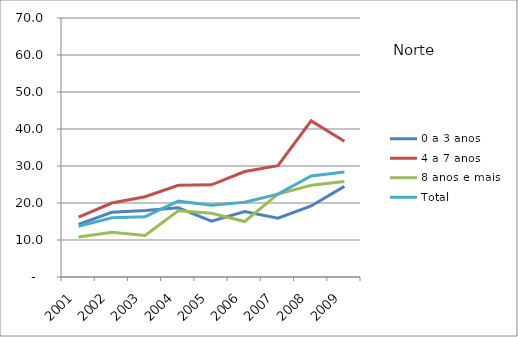
| Category | 0 a 3 anos | 4 a 7 anos | 8 anos e mais | Total |
|---|---|---|---|---|
| 2001.0 | 14.2 | 16.2 | 10.8 | 13.7 |
| 2002.0 | 17.5 | 20 | 12.1 | 16 |
| 2003.0 | 18 | 21.7 | 11.2 | 16.3 |
| 2004.0 | 18.7 | 24.8 | 17.9 | 20.5 |
| 2005.0 | 15.1 | 24.9 | 17.2 | 19.4 |
| 2006.0 | 17.7 | 28.5 | 15 | 20.2 |
| 2007.0 | 15.9 | 30.1 | 22.4 | 22.4 |
| 2008.0 | 19.2 | 42.2 | 24.8 | 27.3 |
| 2009.0 | 24.5 | 36.7 | 25.8 | 28.4 |